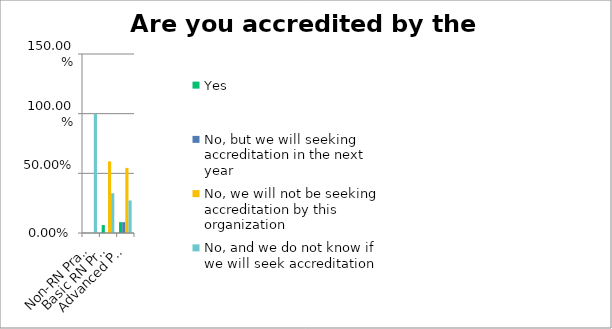
| Category | Yes | No, but we will seeking accreditation in the next year | No, we will not be seeking accreditation by this organization | No, and we do not know if we will seek accreditation |
|---|---|---|---|---|
| Non-RN Practice | 0 | 0 | 0 | 1 |
| Basic RN Practice | 0.067 | 0 | 0.6 | 0.333 |
| Advanced Practice | 0.091 | 0.091 | 0.546 | 0.273 |